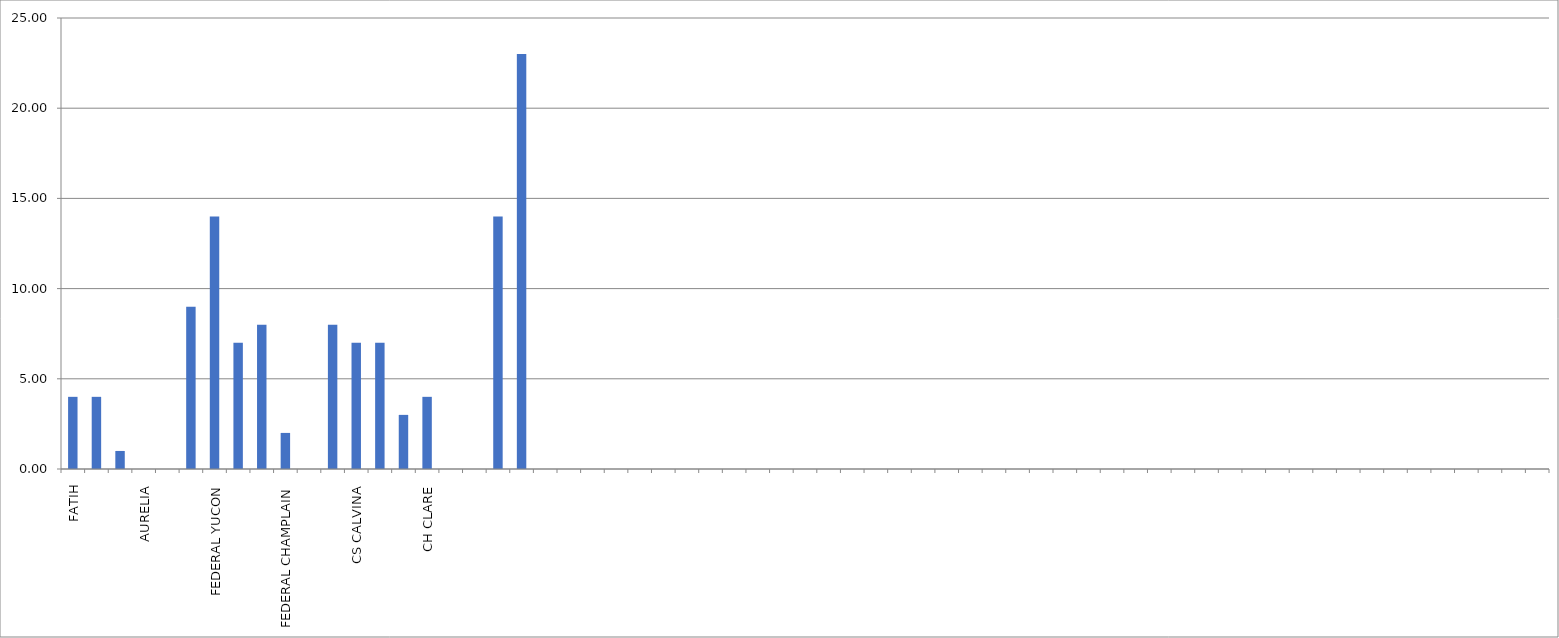
| Category | 0,00 |
|---|---|
| FATIH | 4 |
| ANTHEIA | 4 |
| PACIFIC INTEGRITY | 1 |
| AURELIA | 0 |
| WMF EXPRESS | 0 |
| ORHAM | 9 |
| FEDERAL YUCON | 14 |
| COLUMBIA | 7 |
| CS CAPRICE | 8 |
| FEDERAL CHAMPLAIN | 2 |
| NEDIM | 0 |
| FEDERAL KUSHIRO | 8 |
| CS CALVINA | 7 |
| JERICHO BEACH | 7 |
| ROLLDOCK STAR | 3 |
| CH CLARE | 4 |
| DODO | 0 |
| STAR MAIA | 0 |